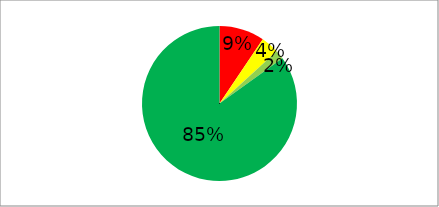
| Category | Series 0 |
|---|---|
| Red | 5 |
| Yellow | 2 |
| Light Green | 1 |
| Dark Green | 45 |